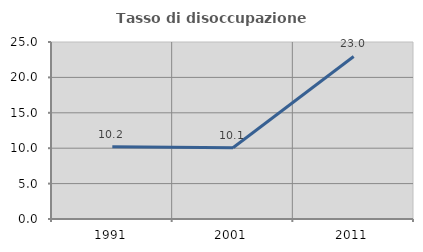
| Category | Tasso di disoccupazione giovanile  |
|---|---|
| 1991.0 | 10.217 |
| 2001.0 | 10.063 |
| 2011.0 | 22.957 |